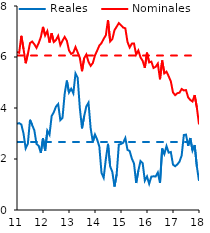
| Category | Reales | Nominales | Promedio reales 2007-2017 | Promedio nominales 2007-2017 |
|---|---|---|---|---|
| 2011-01-31 | 3.383 | 6.195 | 2.667 | 6.058 |
| 2011-02-28 | 3.406 | 6.164 | 2.667 | 6.058 |
| 2011-03-31 | 3.353 | 6.831 | 2.667 | 6.058 |
| 2011-04-30 | 3.004 | 6.318 | 2.667 | 6.058 |
| 2011-05-31 | 2.418 | 5.756 | 2.667 | 6.058 |
| 2011-06-30 | 2.592 | 6.115 | 2.667 | 6.058 |
| 2011-07-31 | 3.537 | 6.544 | 2.667 | 6.058 |
| 2011-08-31 | 3.329 | 6.607 | 2.667 | 6.058 |
| 2011-09-30 | 3.126 | 6.5 | 2.667 | 6.058 |
| 2011-10-31 | 2.591 | 6.359 | 2.667 | 6.058 |
| 2011-11-30 | 2.517 | 6.544 | 2.667 | 6.058 |
| 2011-12-31 | 2.241 | 6.778 | 2.667 | 6.058 |
| 2012-01-31 | 2.814 | 7.181 | 2.667 | 6.058 |
| 2012-02-29 | 2.329 | 6.844 | 2.667 | 6.058 |
| 2012-03-31 | 3.111 | 7.017 | 2.667 | 6.058 |
| 2012-04-30 | 2.952 | 6.567 | 2.667 | 6.058 |
| 2012-05-31 | 3.686 | 6.932 | 2.667 | 6.058 |
| 2012-06-30 | 3.835 | 6.588 | 2.667 | 6.058 |
| 2012-07-31 | 4.059 | 6.668 | 2.667 | 6.058 |
| 2012-08-31 | 4.154 | 6.829 | 2.667 | 6.058 |
| 2012-09-30 | 3.523 | 6.468 | 2.667 | 6.058 |
| 2012-10-31 | 3.614 | 6.64 | 2.667 | 6.058 |
| 2012-11-30 | 4.558 | 6.787 | 2.667 | 6.058 |
| 2012-12-31 | 5.077 | 6.639 | 2.667 | 6.058 |
| 2013-01-31 | 4.607 | 6.258 | 2.667 | 6.058 |
| 2013-02-28 | 4.754 | 6.12 | 2.667 | 6.058 |
| 2013-03-31 | 4.576 | 6.172 | 2.667 | 6.058 |
| 2013-04-30 | 5.353 | 6.39 | 2.667 | 6.058 |
| 2013-05-31 | 5.188 | 6.182 | 2.667 | 6.058 |
| 2013-06-30 | 3.999 | 5.968 | 2.667 | 6.058 |
| 2013-07-31 | 3.202 | 5.443 | 2.667 | 6.058 |
| 2013-08-31 | 3.682 | 5.955 | 2.667 | 6.058 |
| 2013-09-30 | 4.063 | 6.099 | 2.667 | 6.058 |
| 2013-10-31 | 4.21 | 5.809 | 2.667 | 6.058 |
| 2013-11-30 | 3.202 | 5.652 | 2.667 | 6.058 |
| 2013-12-31 | 2.669 | 5.764 | 2.667 | 6.058 |
| 2014-01-31 | 2.959 | 6.064 | 2.667 | 6.058 |
| 2014-02-28 | 2.762 | 6.252 | 2.667 | 6.058 |
| 2014-03-31 | 2.489 | 6.448 | 2.667 | 6.058 |
| 2014-04-30 | 1.457 | 6.546 | 2.667 | 6.058 |
| 2014-05-31 | 1.264 | 6.712 | 2.667 | 6.058 |
| 2014-06-30 | 1.993 | 6.851 | 2.667 | 6.058 |
| 2014-07-31 | 2.594 | 7.45 | 2.667 | 6.058 |
| 2014-08-31 | 1.708 | 6.611 | 2.667 | 6.058 |
| 2014-09-30 | 1.492 | 6.702 | 2.667 | 6.058 |
| 2014-10-31 | 0.919 | 7.052 | 2.667 | 6.058 |
| 2014-11-30 | 1.399 | 7.189 | 2.667 | 6.058 |
| 2014-12-31 | 2.564 | 7.33 | 2.667 | 6.058 |
| 2015-01-31 | 2.59 | 7.248 | 2.667 | 6.058 |
| 2015-02-28 | 2.639 | 7.155 | 2.667 | 6.058 |
| 2015-03-31 | 2.823 | 7.125 | 2.667 | 6.058 |
| 2015-04-30 | 2.356 | 6.59 | 2.667 | 6.058 |
| 2015-05-31 | 2.313 | 6.374 | 2.667 | 6.058 |
| 2015-06-30 | 2.017 | 6.525 | 2.667 | 6.058 |
| 2015-07-31 | 1.825 | 6.527 | 2.667 | 6.058 |
| 2015-08-31 | 1.059 | 6.095 | 2.667 | 6.058 |
| 2015-09-30 | 1.539 | 6.256 | 2.667 | 6.058 |
| 2015-10-31 | 1.92 | 5.986 | 2.667 | 6.058 |
| 2015-11-30 | 1.839 | 5.848 | 2.667 | 6.058 |
| 2015-12-31 | 1.149 | 5.577 | 2.667 | 6.058 |
| 2016-01-31 | 1.318 | 6.17 | 2.667 | 6.058 |
| 2016-02-29 | 1.028 | 5.788 | 2.667 | 6.058 |
| 2016-03-31 | 1.308 | 5.819 | 2.667 | 6.058 |
| 2016-04-30 | 1.321 | 5.57 | 2.667 | 6.058 |
| 2016-05-31 | 1.315 | 5.614 | 2.667 | 6.058 |
| 2016-06-30 | 1.472 | 5.741 | 2.667 | 6.058 |
| 2016-07-31 | 1.065 | 5.127 | 2.667 | 6.058 |
| 2016-08-31 | 2.41 | 5.863 | 2.667 | 6.058 |
| 2016-09-30 | 2.194 | 5.358 | 2.667 | 6.058 |
| 2016-10-31 | 2.507 | 5.426 | 2.667 | 6.058 |
| 2016-11-30 | 2.25 | 5.246 | 2.667 | 6.058 |
| 2016-12-31 | 2.273 | 5.043 | 2.667 | 6.058 |
| 2017-01-31 | 1.779 | 4.608 | 2.667 | 6.058 |
| 2017-02-28 | 1.716 | 4.503 | 2.667 | 6.058 |
| 2017-03-31 | 1.788 | 4.58 | 2.667 | 6.058 |
| 2017-04-30 | 1.896 | 4.601 | 2.667 | 6.058 |
| 2017-05-31 | 2.137 | 4.746 | 2.667 | 6.058 |
| 2017-06-30 | 2.94 | 4.688 | 2.667 | 6.058 |
| 2017-07-31 | 2.958 | 4.704 | 2.667 | 6.058 |
| 2017-08-31 | 2.516 | 4.415 | 2.667 | 6.058 |
| 2017-09-30 | 2.822 | 4.315 | 2.667 | 6.058 |
| 2017-10-31 | 2.333 | 4.255 | 2.667 | 6.058 |
| 2017-11-01 | 2.548 | 4.507 | 2.667 | 6.058 |
| 2017-12-01 | 1.714 | 4.022 | 2.667 | 6.058 |
| 2018-01-01 | 1.143 | 3.357 | 2.667 | 6.058 |